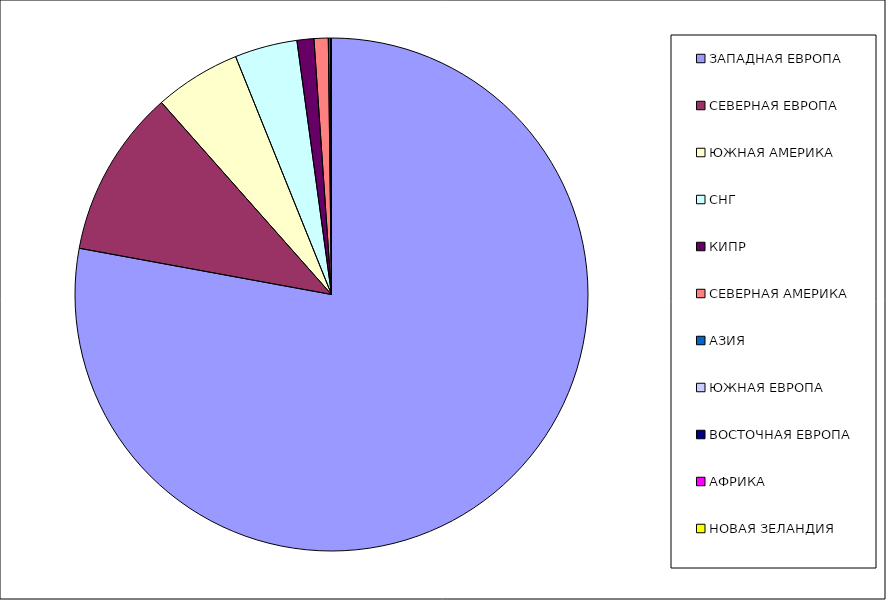
| Category | Оборот |
|---|---|
| ЗАПАДНАЯ ЕВРОПА | 0.779 |
| СЕВЕРНАЯ ЕВРОПА | 0.106 |
| ЮЖНАЯ АМЕРИКА | 0.054 |
| СНГ | 0.039 |
| КИПР | 0.011 |
| СЕВЕРНАЯ АМЕРИКА | 0.009 |
| АЗИЯ | 0.001 |
| ЮЖНАЯ ЕВРОПА | 0 |
| ВОСТОЧНАЯ ЕВРОПА | 0 |
| АФРИКА | 0 |
| НОВАЯ ЗЕЛАНДИЯ | 0 |